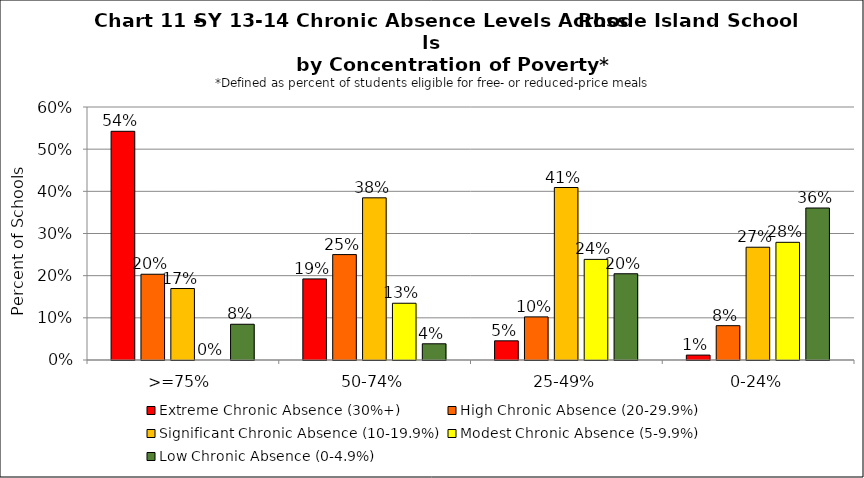
| Category | Extreme Chronic Absence (30%+) | High Chronic Absence (20-29.9%) | Significant Chronic Absence (10-19.9%) | Modest Chronic Absence (5-9.9%) | Low Chronic Absence (0-4.9%) |
|---|---|---|---|---|---|
| 0 | 0.542 | 0.203 | 0.169 | 0 | 0.085 |
| 1 | 0.192 | 0.25 | 0.385 | 0.135 | 0.038 |
| 2 | 0.045 | 0.102 | 0.409 | 0.239 | 0.205 |
| 3 | 0.012 | 0.081 | 0.267 | 0.279 | 0.36 |